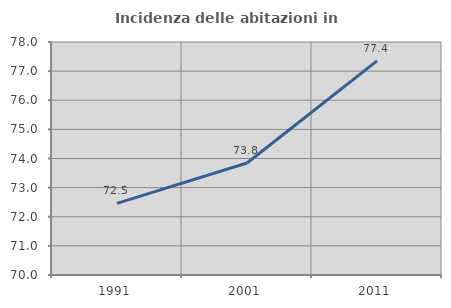
| Category | Incidenza delle abitazioni in proprietà  |
|---|---|
| 1991.0 | 72.457 |
| 2001.0 | 73.846 |
| 2011.0 | 77.353 |